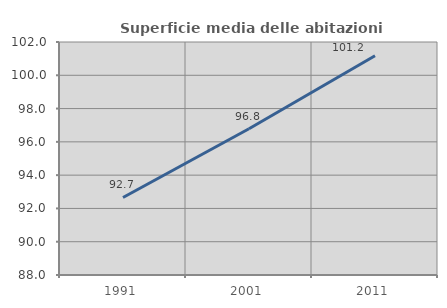
| Category | Superficie media delle abitazioni occupate |
|---|---|
| 1991.0 | 92.658 |
| 2001.0 | 96.786 |
| 2011.0 | 101.173 |